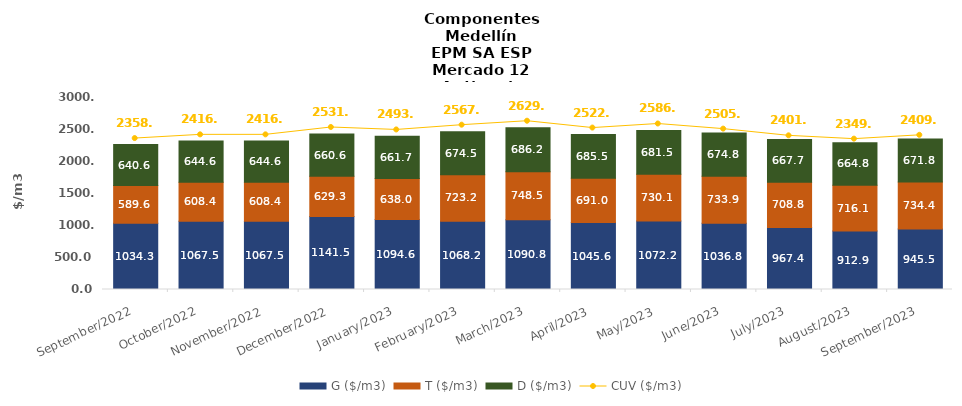
| Category | G ($/m3) | T ($/m3) | D ($/m3) |
|---|---|---|---|
| 2022-09-01 | 1034.31 | 589.64 | 640.63 |
| 2022-10-01 | 1067.51 | 608.44 | 644.64 |
| 2022-11-01 | 1067.51 | 608.44 | 644.64 |
| 2022-12-01 | 1141.53 | 629.26 | 660.56 |
| 2023-01-01 | 1094.64 | 637.95 | 661.67 |
| 2023-02-01 | 1068.19 | 723.22 | 674.52 |
| 2023-03-01 | 1090.77 | 748.48 | 686.22 |
| 2023-04-01 | 1045.58 | 690.98 | 685.49 |
| 2023-05-01 | 1072.19 | 730.14 | 681.45 |
| 2023-06-01 | 1036.8 | 733.9 | 674.81 |
| 2023-07-01 | 967.35 | 708.84 | 667.66 |
| 2023-08-01 | 912.93 | 716.07 | 664.76 |
| 2023-09-01 | 945.5 | 734.35 | 671.79 |